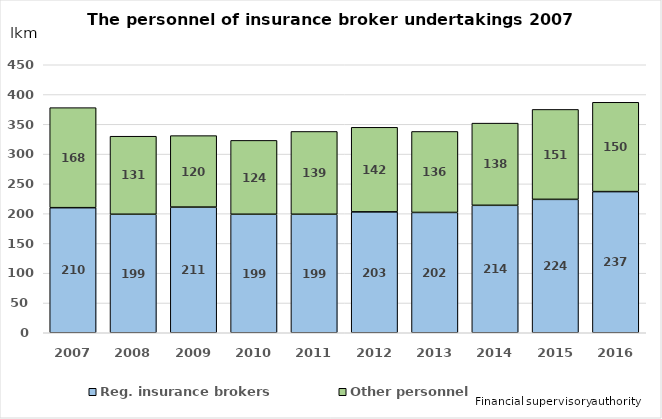
| Category | Reg. insurance brokers | Other personnel |
|---|---|---|
| 2007.0 | 210 | 168 |
| 2008.0 | 199 | 131 |
| 2009.0 | 211 | 120 |
| 2010.0 | 199 | 124 |
| 2011.0 | 199 | 139 |
| 2012.0 | 203 | 142 |
| 2013.0 | 202 | 136 |
| 2014.0 | 214 | 138 |
| 2015.0 | 224 | 151 |
| 2016.0 | 237 | 150 |